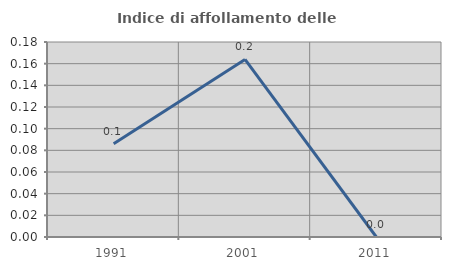
| Category | Indice di affollamento delle abitazioni  |
|---|---|
| 1991.0 | 0.086 |
| 2001.0 | 0.164 |
| 2011.0 | 0 |